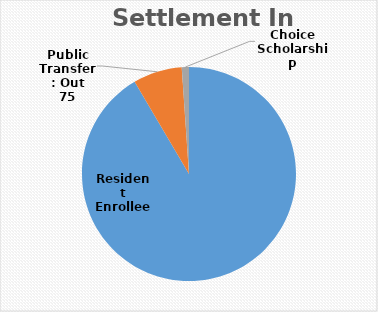
| Category | Series 0 |
|---|---|
| Resident Enrollee | 928 |
| Public Transfer: Out | 75 |
| Choice Scholarship | 11 |